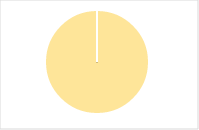
| Category | Total |
|---|---|
| Y | 0 |
| R | 0 |
| T | 0 |
| M | 0 |
| F | 0 |
| N | 105 |